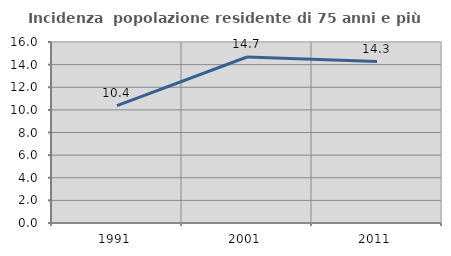
| Category | Incidenza  popolazione residente di 75 anni e più |
|---|---|
| 1991.0 | 10.381 |
| 2001.0 | 14.674 |
| 2011.0 | 14.266 |